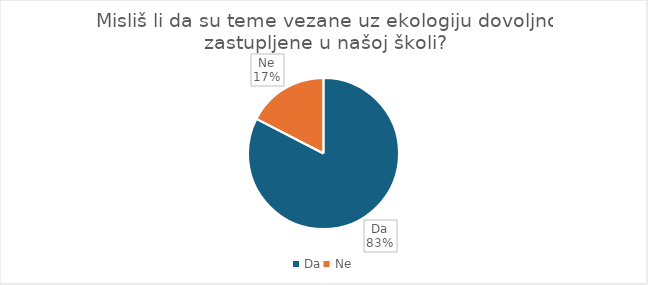
| Category | Series 0 |
|---|---|
| Da | 90 |
| Ne | 19 |